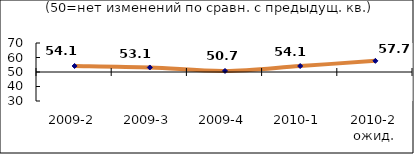
| Category | Диф.индекс ↓ |
|---|---|
| 2009-2 | 54.14 |
| 2009-3 | 53.125 |
| 2009-4 | 50.73 |
| 2010-1 | 54.12 |
| 2010-2 ожид. | 57.69 |